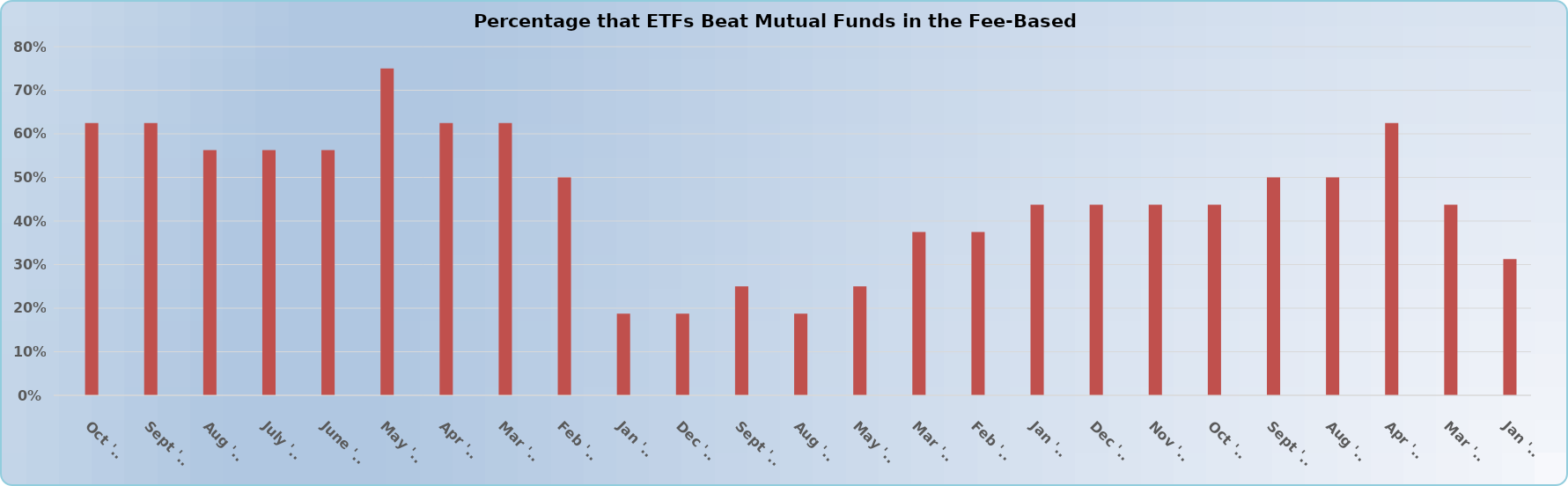
| Category | Series 0 | Series 1 |
|---|---|---|
| Oct '16 |  | 0.625 |
| Sept '16 |  | 0.625 |
| Aug '16 |  | 0.562 |
| July '16 |  | 0.562 |
| June '16 |  | 0.562 |
| May '16 |  | 0.75 |
| Apr '16 |  | 0.625 |
| Mar '16 |  | 0.625 |
| Feb '16 |  | 0.5 |
| Jan '16 |  | 0.188 |
| Dec '15 |  | 0.188 |
| Sept '15 |  | 0.25 |
| Aug '15 |  | 0.188 |
| May '15 |  | 0.25 |
| Mar '15 |  | 0.375 |
| Feb '15 |  | 0.375 |
| Jan '15 |  | 0.438 |
| Dec '14 |  | 0.438 |
| Nov '14 |  | 0.438 |
| Oct '14 |  | 0.438 |
| Sept '14 |  | 0.5 |
| Aug '14 |  | 0.5 |
| Apr '14 |  | 0.625 |
| Mar '14 |  | 0.438 |
| Jan '14 |  | 0.312 |